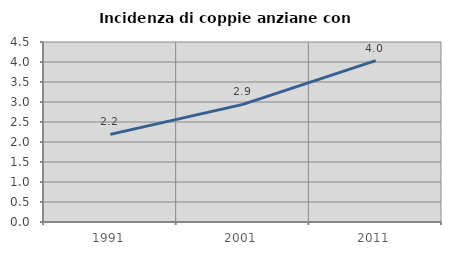
| Category | Incidenza di coppie anziane con figli |
|---|---|
| 1991.0 | 2.19 |
| 2001.0 | 2.941 |
| 2011.0 | 4.035 |